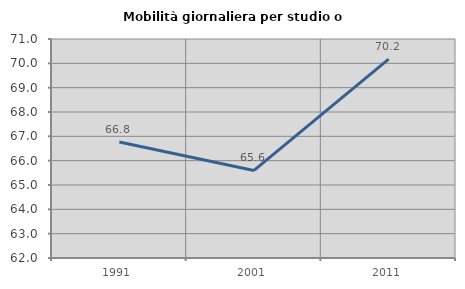
| Category | Mobilità giornaliera per studio o lavoro |
|---|---|
| 1991.0 | 66.769 |
| 2001.0 | 65.599 |
| 2011.0 | 70.172 |